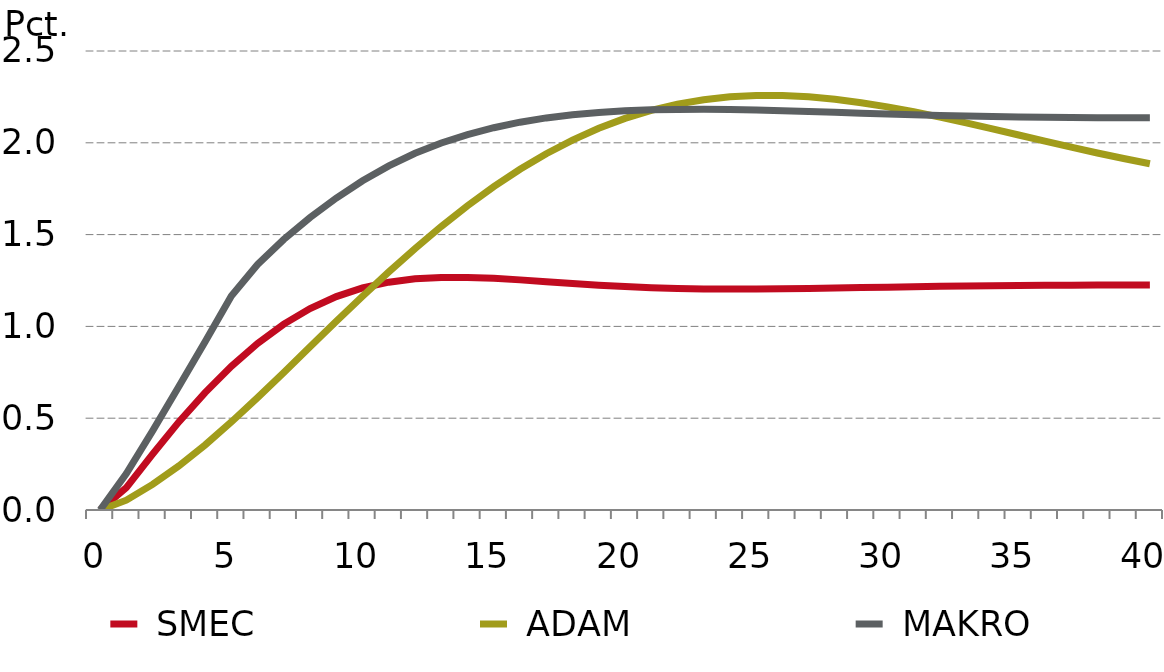
| Category |  SMEC |  ADAM |  MAKRO |
|---|---|---|---|
| 0.0 | 0 | 0 | 0 |
| nan | 0.122 | 0.053 | 0.198 |
| nan | 0.304 | 0.14 | 0.431 |
| nan | 0.48 | 0.24 | 0.672 |
| nan | 0.64 | 0.354 | 0.916 |
| 5.0 | 0.782 | 0.479 | 1.165 |
| nan | 0.907 | 0.612 | 1.337 |
| nan | 1.013 | 0.749 | 1.474 |
| nan | 1.097 | 0.889 | 1.593 |
| nan | 1.163 | 1.028 | 1.699 |
| 10.0 | 1.21 | 1.164 | 1.793 |
| nan | 1.241 | 1.297 | 1.874 |
| nan | 1.259 | 1.424 | 1.943 |
| nan | 1.267 | 1.545 | 1.999 |
| nan | 1.267 | 1.657 | 2.045 |
| 15.0 | 1.262 | 1.761 | 2.082 |
| nan | 1.253 | 1.856 | 2.112 |
| nan | 1.244 | 1.94 | 2.136 |
| nan | 1.234 | 2.015 | 2.153 |
| nan | 1.225 | 2.079 | 2.165 |
| 20.0 | 1.217 | 2.133 | 2.174 |
| nan | 1.211 | 2.177 | 2.179 |
| nan | 1.207 | 2.21 | 2.182 |
| nan | 1.204 | 2.235 | 2.183 |
| nan | 1.203 | 2.25 | 2.181 |
| 25.0 | 1.203 | 2.258 | 2.179 |
| nan | 1.205 | 2.257 | 2.175 |
| nan | 1.207 | 2.25 | 2.171 |
| nan | 1.209 | 2.237 | 2.166 |
| nan | 1.211 | 2.219 | 2.161 |
| 30.0 | 1.214 | 2.196 | 2.157 |
| nan | 1.216 | 2.169 | 2.153 |
| nan | 1.218 | 2.14 | 2.149 |
| nan | 1.22 | 2.108 | 2.146 |
| nan | 1.221 | 2.076 | 2.143 |
| 35.0 | 1.223 | 2.042 | 2.141 |
| nan | 1.224 | 2.009 | 2.139 |
| nan | 1.224 | 1.976 | 2.138 |
| nan | 1.225 | 1.945 | 2.137 |
| nan | 1.225 | 1.914 | 2.136 |
| 40.0 | 1.225 | 1.886 | 2.136 |